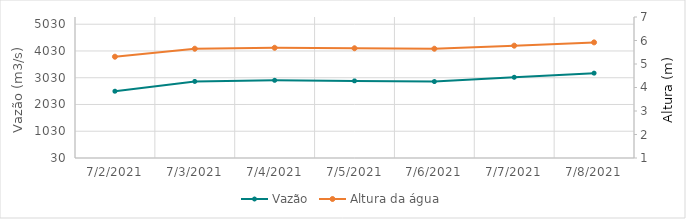
| Category | Vazão |
|---|---|
| 6/6/21 | 4147.07 |
| 6/5/21 | 4234.87 |
| 6/4/21 | 4219.22 |
| 6/3/21 | 3876.08 |
| 6/2/21 | 3561.24 |
| 6/1/21 | 3512.96 |
| 5/31/21 | 3456.77 |